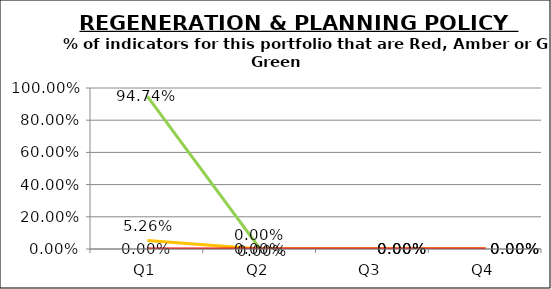
| Category | Green | Amber | Red |
|---|---|---|---|
| Q1 | 0.947 | 0.053 | 0 |
| Q2 | 0 | 0 | 0 |
| Q3 | 0 | 0 | 0 |
| Q4 | 0 | 0 | 0 |